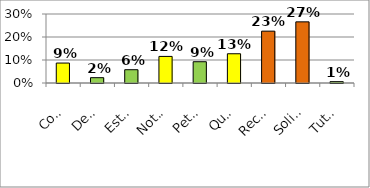
| Category | Series 0 |
|---|---|
| Consulta | 0.087 |
| Denuncia  | 0.023 |
| Estado Radicado | 0.058 |
| Notificaciòn | 0.116 |
| Peticiòn Informativa | 0.092 |
| Queja  | 0.127 |
| Reclamo | 0.225 |
| Solicitud | 0.266 |
| Tutela | 0.006 |